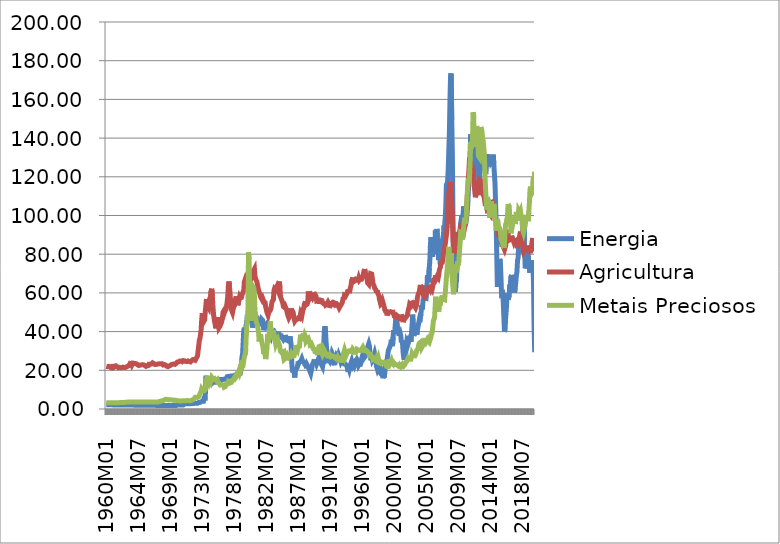
| Category | Energia | Agricultura | Metais Preciosos |
|---|---|---|---|
| 1960M01 | 2.134 | 22.032 | 3.269 |
| 1960M02 | 2.134 | 21.808 | 3.269 |
| 1960M03 | 2.134 | 21.896 | 3.269 |
| 1960M04 | 2.134 | 22.04 | 3.269 |
| 1960M05 | 2.134 | 22.049 | 3.269 |
| 1960M06 | 2.134 | 21.743 | 3.269 |
| 1960M07 | 2.134 | 21.682 | 3.269 |
| 1960M08 | 2.134 | 21.726 | 3.269 |
| 1960M09 | 2.134 | 21.878 | 3.269 |
| 1960M10 | 2.134 | 21.218 | 3.269 |
| 1960M11 | 2.134 | 20.765 | 3.269 |
| 1960M12 | 2.134 | 21.111 | 3.269 |
| 1961M01 | 2.083 | 21.223 | 3.267 |
| 1961M02 | 2.083 | 21.654 | 3.267 |
| 1961M03 | 2.083 | 22.199 | 3.267 |
| 1961M04 | 2.083 | 22.438 | 3.267 |
| 1961M05 | 2.083 | 22.354 | 3.267 |
| 1961M06 | 2.083 | 21.982 | 3.267 |
| 1961M07 | 2.083 | 21.842 | 3.267 |
| 1961M08 | 2.083 | 21.619 | 3.267 |
| 1961M09 | 2.083 | 21.386 | 3.267 |
| 1961M10 | 2.083 | 21.354 | 3.267 |
| 1961M11 | 2.083 | 21.582 | 3.276 |
| 1961M12 | 2.083 | 21.59 | 3.38 |
| 1962M01 | 2.043 | 21.317 | 3.387 |
| 1962M02 | 2.043 | 21.414 | 3.37 |
| 1962M03 | 2.043 | 21.411 | 3.361 |
| 1962M04 | 2.043 | 21.447 | 3.361 |
| 1962M05 | 2.043 | 21.657 | 3.361 |
| 1962M06 | 2.043 | 21.552 | 3.369 |
| 1962M07 | 2.043 | 21.477 | 3.381 |
| 1962M08 | 2.043 | 21.346 | 3.425 |
| 1962M09 | 2.043 | 21.489 | 3.492 |
| 1962M10 | 2.043 | 21.241 | 3.541 |
| 1962M11 | 2.043 | 21.728 | 3.527 |
| 1962M12 | 2.043 | 21.696 | 3.534 |
| 1963M01 | 2.015 | 22.077 | 3.567 |
| 1963M02 | 2.015 | 22.329 | 3.579 |
| 1963M03 | 2.015 | 22.384 | 3.593 |
| 1963M04 | 2.015 | 22.726 | 3.585 |
| 1963M05 | 2.015 | 23.479 | 3.59 |
| 1963M06 | 2.015 | 23.402 | 3.588 |
| 1963M07 | 2.015 | 23.203 | 3.601 |
| 1963M08 | 2.015 | 22.584 | 3.599 |
| 1963M09 | 2.015 | 22.697 | 3.608 |
| 1963M10 | 2.015 | 23.724 | 3.608 |
| 1963M11 | 2.015 | 23.737 | 3.613 |
| 1963M12 | 2.015 | 23.585 | 3.614 |
| 1964M01 | 1.944 | 23.984 | 3.624 |
| 1964M02 | 1.944 | 23.485 | 3.624 |
| 1964M03 | 1.944 | 23.28 | 3.624 |
| 1964M04 | 1.944 | 23.356 | 3.624 |
| 1964M05 | 1.944 | 23.185 | 3.624 |
| 1964M06 | 1.944 | 22.778 | 3.624 |
| 1964M07 | 1.944 | 22.65 | 3.624 |
| 1964M08 | 1.944 | 22.456 | 3.624 |
| 1964M09 | 1.944 | 22.637 | 3.624 |
| 1964M10 | 1.944 | 22.729 | 3.624 |
| 1964M11 | 1.944 | 22.687 | 3.624 |
| 1964M12 | 1.944 | 22.77 | 3.624 |
| 1965M01 | 1.939 | 22.439 | 3.635 |
| 1965M02 | 1.939 | 22.927 | 3.646 |
| 1965M03 | 1.939 | 22.739 | 3.646 |
| 1965M04 | 1.939 | 22.802 | 3.646 |
| 1965M05 | 1.939 | 22.587 | 3.646 |
| 1965M06 | 1.939 | 22.499 | 3.646 |
| 1965M07 | 1.939 | 22.385 | 3.646 |
| 1965M08 | 1.939 | 22.025 | 3.646 |
| 1965M09 | 1.939 | 22.272 | 3.646 |
| 1965M10 | 1.939 | 22.294 | 3.646 |
| 1965M11 | 1.939 | 22.288 | 3.646 |
| 1965M12 | 1.939 | 22.455 | 3.646 |
| 1966M01 | 1.882 | 23.1 | 3.647 |
| 1966M02 | 1.882 | 23.022 | 3.647 |
| 1966M03 | 1.882 | 23.096 | 3.649 |
| 1966M04 | 1.882 | 23.299 | 3.65 |
| 1966M05 | 1.882 | 23.221 | 3.65 |
| 1966M06 | 1.882 | 23.403 | 3.65 |
| 1966M07 | 1.882 | 23.864 | 3.65 |
| 1966M08 | 1.882 | 24.165 | 3.65 |
| 1966M09 | 1.882 | 23.508 | 3.65 |
| 1966M10 | 1.882 | 23.168 | 3.65 |
| 1966M11 | 1.882 | 23.048 | 3.65 |
| 1966M12 | 1.882 | 23.137 | 3.65 |
| 1967M01 | 1.866 | 23.052 | 3.644 |
| 1967M02 | 1.866 | 23.047 | 3.66 |
| 1967M03 | 1.866 | 23.138 | 3.66 |
| 1967M04 | 1.866 | 23.212 | 3.66 |
| 1967M05 | 1.866 | 23.298 | 3.662 |
| 1967M06 | 1.866 | 23.636 | 3.667 |
| 1967M07 | 1.866 | 23.407 | 3.941 |
| 1967M08 | 1.866 | 23.119 | 4.089 |
| 1967M09 | 1.866 | 23.338 | 4.023 |
| 1967M10 | 1.866 | 23.377 | 4.123 |
| 1967M11 | 1.866 | 23.385 | 4.28 |
| 1967M12 | 1.866 | 22.95 | 4.39 |
| 1968M01 | 1.853 | 22.778 | 4.356 |
| 1968M02 | 1.853 | 22.99 | 4.256 |
| 1968M03 | 1.853 | 22.984 | 4.626 |
| 1968M04 | 1.853 | 22.711 | 4.701 |
| 1968M05 | 1.853 | 22.727 | 5.045 |
| 1968M06 | 1.853 | 22.211 | 5.155 |
| 1968M07 | 1.853 | 22.089 | 4.93 |
| 1968M08 | 1.853 | 21.636 | 4.8 |
| 1968M09 | 1.853 | 21.879 | 4.876 |
| 1968M10 | 1.853 | 21.889 | 4.593 |
| 1968M11 | 1.853 | 22.22 | 4.672 |
| 1968M12 | 1.853 | 22.478 | 4.699 |
| 1969M01 | 1.813 | 22.493 | 4.795 |
| 1969M02 | 1.813 | 22.552 | 4.684 |
| 1969M03 | 1.813 | 22.976 | 4.706 |
| 1969M04 | 1.813 | 22.959 | 4.671 |
| 1969M05 | 1.813 | 23.167 | 4.664 |
| 1969M06 | 1.813 | 23.429 | 4.428 |
| 1969M07 | 1.813 | 23.234 | 4.422 |
| 1969M08 | 1.813 | 23.181 | 4.412 |
| 1969M09 | 1.813 | 23.064 | 4.523 |
| 1969M10 | 1.813 | 23.549 | 4.578 |
| 1969M11 | 1.813 | 23.6 | 4.452 |
| 1969M12 | 1.813 | 23.814 | 4.201 |
| 1970M01 | 2.113 | 24.26 | 4.252 |
| 1970M02 | 2.113 | 24.303 | 4.273 |
| 1970M03 | 2.113 | 24.362 | 4.273 |
| 1970M04 | 2.113 | 24.549 | 4.273 |
| 1970M05 | 2.113 | 24.791 | 4.122 |
| 1970M06 | 2.113 | 24.849 | 4.06 |
| 1970M07 | 2.113 | 24.768 | 4.098 |
| 1970M08 | 2.113 | 24.547 | 4.206 |
| 1970M09 | 2.113 | 24.459 | 4.261 |
| 1970M10 | 2.113 | 24.842 | 4.293 |
| 1970M11 | 2.113 | 25.051 | 4.302 |
| 1970M12 | 2.113 | 24.968 | 4.184 |
| 1971M01 | 2.656 | 24.883 | 4.209 |
| 1971M02 | 2.656 | 24.642 | 4.214 |
| 1971M03 | 2.656 | 24.601 | 4.286 |
| 1971M04 | 2.656 | 24.59 | 4.349 |
| 1971M05 | 2.656 | 24.523 | 4.389 |
| 1971M06 | 2.656 | 24.468 | 4.307 |
| 1971M07 | 2.763 | 24.831 | 4.336 |
| 1971M08 | 2.763 | 25 | 4.453 |
| 1971M09 | 2.763 | 24.552 | 4.255 |
| 1971M10 | 2.763 | 24.522 | 4.204 |
| 1971M11 | 2.763 | 24.358 | 4.212 |
| 1971M12 | 2.763 | 24.557 | 4.32 |
| 1972M01 | 2.872 | 24.956 | 4.539 |
| 1972M02 | 2.872 | 24.946 | 4.727 |
| 1972M03 | 2.872 | 25.557 | 4.763 |
| 1972M04 | 2.872 | 25.545 | 4.841 |
| 1972M05 | 2.872 | 25.48 | 5.206 |
| 1972M06 | 2.872 | 25.219 | 5.667 |
| 1972M07 | 2.979 | 25.184 | 6.062 |
| 1972M08 | 2.979 | 25.582 | 6.262 |
| 1972M09 | 2.979 | 26.306 | 6.097 |
| 1972M10 | 2.979 | 26.713 | 6.091 |
| 1972M11 | 2.979 | 27.461 | 5.987 |
| 1972M12 | 2.979 | 30.239 | 6.186 |
| 1973M01 | 3.396 | 32.755 | 6.302 |
| 1973M02 | 3.396 | 35.547 | 7.103 |
| 1973M03 | 3.396 | 36.329 | 7.839 |
| 1973M04 | 3.685 | 36.58 | 8.133 |
| 1973M05 | 3.685 | 40.753 | 9.043 |
| 1973M06 | 3.685 | 45.999 | 10.403 |
| 1973M07 | 4.059 | 49.506 | 10.485 |
| 1973M08 | 4.059 | 49.319 | 9.569 |
| 1973M09 | 4.059 | 44.957 | 9.37 |
| 1973M10 | 5.557 | 44.472 | 9.395 |
| 1973M11 | 5.557 | 46.079 | 9.043 |
| 1973M12 | 5.557 | 50.09 | 10.052 |
| 1974M01 | 15.97 | 53.311 | 11.954 |
| 1974M02 | 15.97 | 56.849 | 14.922 |
| 1974M03 | 15.97 | 55.345 | 16.052 |
| 1974M04 | 13.402 | 53.181 | 16.023 |
| 1974M05 | 13.402 | 52.717 | 15.829 |
| 1974M06 | 13.402 | 52.126 | 14.785 |
| 1974M07 | 12.76 | 54.121 | 13.627 |
| 1974M08 | 12.76 | 57.876 | 14.383 |
| 1974M09 | 12.76 | 57.191 | 13.84 |
| 1974M10 | 13.081 | 61.247 | 15.02 |
| 1974M11 | 13.081 | 62.155 | 16.345 |
| 1974M12 | 13.081 | 58.175 | 16.196 |
| 1975M01 | 13.836 | 52.93 | 15.532 |
| 1975M02 | 13.836 | 48.895 | 15.881 |
| 1975M03 | 13.836 | 46.725 | 15.742 |
| 1975M04 | 13.836 | 46.445 | 15.074 |
| 1975M05 | 13.836 | 43.163 | 15.221 |
| 1975M06 | 13.836 | 41.665 | 14.975 |
| 1975M07 | 13.847 | 43.831 | 15.242 |
| 1975M08 | 13.847 | 47.396 | 15.337 |
| 1975M09 | 13.847 | 45.569 | 13.756 |
| 1975M10 | 13.879 | 44.249 | 13.487 |
| 1975M11 | 13.879 | 41.889 | 13.442 |
| 1975M12 | 13.879 | 41.617 | 13.011 |
| 1976M01 | 15.188 | 42.849 | 12.467 |
| 1976M02 | 15.188 | 43.742 | 12.489 |
| 1976M03 | 15.188 | 44.367 | 12.694 |
| 1976M04 | 15.201 | 45.429 | 12.544 |
| 1976M05 | 15.201 | 47.216 | 12.604 |
| 1976M06 | 15.241 | 49.98 | 12.838 |
| 1976M07 | 15.337 | 50.504 | 12.299 |
| 1976M08 | 15.363 | 49.562 | 11.318 |
| 1976M09 | 15.363 | 50.512 | 11.616 |
| 1976M10 | 15.71 | 50.643 | 11.663 |
| 1976M11 | 15.723 | 51.397 | 12.696 |
| 1976M12 | 15.736 | 53.004 | 12.913 |
| 1977M01 | 16.72 | 55.458 | 12.867 |
| 1977M02 | 16.773 | 58.396 | 13.24 |
| 1977M03 | 16.825 | 63.486 | 14.318 |
| 1977M04 | 16.798 | 65.9 | 14.302 |
| 1977M05 | 16.798 | 62.873 | 14.046 |
| 1977M06 | 16.863 | 59.252 | 13.458 |
| 1977M07 | 17.069 | 54.032 | 13.67 |
| 1977M08 | 17.056 | 51.597 | 13.712 |
| 1977M09 | 17.069 | 50.629 | 14.067 |
| 1977M10 | 17.135 | 49.854 | 14.888 |
| 1977M11 | 17.122 | 51.418 | 15.175 |
| 1977M12 | 17.135 | 52.656 | 14.984 |
| 1978M01 | 17.396 | 53.08 | 16.037 |
| 1978M02 | 17.371 | 53.835 | 16.432 |
| 1978M03 | 17.384 | 56.473 | 17.078 |
| 1978M04 | 17.392 | 58.204 | 16.424 |
| 1978M05 | 17.526 | 57.006 | 16.496 |
| 1978M06 | 17.63 | 55.921 | 17.176 |
| 1978M07 | 17.647 | 53.614 | 17.525 |
| 1978M08 | 17.695 | 53.837 | 18.849 |
| 1978M09 | 17.718 | 56.504 | 19.269 |
| 1978M10 | 17.772 | 57.965 | 20.707 |
| 1978M11 | 18.159 | 57.422 | 19.283 |
| 1978M12 | 19.59 | 56.952 | 19.471 |
| 1979M01 | 23.363 | 57.587 | 20.994 |
| 1979M02 | 26.933 | 58.911 | 23.345 |
| 1979M03 | 28.362 | 59.849 | 23.151 |
| 1979M04 | 28.803 | 60.655 | 22.971 |
| 1979M05 | 40.706 | 61.249 | 25.107 |
| 1979M06 | 41.989 | 65.692 | 26.644 |
| 1979M07 | 40.771 | 66.589 | 28.066 |
| 1979M08 | 41.411 | 65.372 | 28.654 |
| 1979M09 | 43.015 | 66.306 | 36.414 |
| 1979M10 | 44.992 | 65.449 | 41.562 |
| 1979M11 | 48.75 | 65.765 | 41.57 |
| 1979M12 | 47.707 | 66.551 | 51.219 |
| 1980M01 | 47.621 | 66.765 | 81.058 |
| 1980M02 | 45.814 | 68.937 | 77.165 |
| 1980M03 | 45.599 | 67.003 | 59.915 |
| 1980M04 | 45.547 | 65.835 | 48.108 |
| 1980M05 | 46.148 | 68.379 | 45.684 |
| 1980M06 | 46.136 | 67.657 | 54.291 |
| 1980M07 | 44.489 | 68.008 | 57.558 |
| 1980M08 | 42.059 | 69.07 | 56.124 |
| 1980M09 | 42.008 | 71.216 | 62.887 |
| 1980M10 | 46.876 | 71.55 | 62.348 |
| 1980M11 | 50.115 | 72.392 | 58.429 |
| 1980M12 | 49.501 | 68.347 | 50.885 |
| 1981M01 | 49.786 | 68.662 | 50.389 |
| 1981M02 | 47.832 | 66.485 | 44.994 |
| 1981M03 | 47.576 | 65.866 | 44.296 |
| 1981M04 | 46.894 | 64.555 | 43.251 |
| 1981M05 | 44.689 | 62.875 | 41.604 |
| 1981M06 | 43.004 | 61.337 | 39.583 |
| 1981M07 | 43.938 | 61.228 | 34.873 |
| 1981M08 | 44.46 | 59.676 | 35.279 |
| 1981M09 | 44.538 | 58.372 | 38.515 |
| 1981M10 | 45.246 | 57.621 | 37.331 |
| 1981M11 | 46.443 | 57.418 | 35.087 |
| 1981M12 | 46.167 | 56.444 | 34.798 |
| 1982M01 | 45.757 | 57.069 | 32.657 |
| 1982M02 | 42.877 | 56.584 | 32.28 |
| 1982M03 | 40.689 | 55.458 | 28.418 |
| 1982M04 | 42.252 | 55.188 | 29.805 |
| 1982M05 | 43.897 | 55.044 | 28.107 |
| 1982M06 | 43.601 | 52.811 | 25.794 |
| 1982M07 | 43.788 | 51.433 | 28.188 |
| 1982M08 | 43.332 | 50.097 | 30.417 |
| 1982M09 | 44.494 | 49.839 | 36.708 |
| 1982M10 | 44.885 | 48.418 | 36.314 |
| 1982M11 | 43.913 | 49.693 | 36.255 |
| 1982M12 | 41.957 | 50.256 | 38.914 |
| 1983M01 | 40.78 | 50.374 | 43.085 |
| 1983M02 | 39.132 | 51.144 | 45.268 |
| 1983M03 | 38.178 | 52.153 | 37.471 |
| 1983M04 | 39.582 | 54.255 | 39.248 |
| 1983M05 | 39.226 | 55.71 | 40.869 |
| 1983M06 | 39.953 | 55.403 | 38.111 |
| 1983M07 | 40.009 | 56.467 | 37.775 |
| 1983M08 | 40.287 | 61.361 | 38.655 |
| 1983M09 | 39.78 | 62.324 | 38.267 |
| 1983M10 | 39.178 | 62.425 | 35.095 |
| 1983M11 | 38.593 | 61.73 | 33.313 |
| 1983M12 | 38.098 | 61.774 | 34.059 |
| 1984M01 | 38.252 | 63.194 | 32.079 |
| 1984M02 | 38.476 | 62.288 | 33.878 |
| 1984M03 | 38.776 | 63.672 | 34.918 |
| 1984M04 | 38.78 | 64.259 | 33.709 |
| 1984M05 | 38.698 | 65.865 | 33.186 |
| 1984M06 | 38.416 | 62.786 | 33.009 |
| 1984M07 | 37.252 | 58.025 | 29.789 |
| 1984M08 | 37.461 | 57.142 | 29.915 |
| 1984M09 | 37.566 | 56.867 | 29.088 |
| 1984M10 | 37.044 | 55.579 | 29.169 |
| 1984M11 | 36.847 | 54.464 | 29.428 |
| 1984M12 | 35.947 | 52.865 | 27.15 |
| 1985M01 | 35.789 | 52.648 | 25.521 |
| 1985M02 | 36.915 | 52.407 | 25.243 |
| 1985M03 | 37.065 | 52.984 | 26.075 |
| 1985M04 | 37.037 | 53.202 | 27.388 |
| 1985M05 | 35.663 | 51.471 | 26.516 |
| 1985M06 | 35.425 | 50.23 | 26.452 |
| 1985M07 | 35.352 | 48.799 | 26.332 |
| 1985M08 | 35.977 | 47.89 | 27.392 |
| 1985M09 | 35.876 | 47.048 | 26.861 |
| 1985M10 | 36.702 | 46.934 | 27.159 |
| 1985M11 | 37.527 | 48.223 | 26.834 |
| 1985M12 | 35.176 | 50.623 | 26.63 |
| 1986M01 | 33.149 | 51.965 | 28.464 |
| 1986M02 | 23.743 | 50.903 | 27.796 |
| 1986M03 | 19.976 | 51.2 | 28.083 |
| 1986M04 | 19.095 | 50.273 | 27.35 |
| 1986M05 | 20.856 | 48.856 | 27.357 |
| 1986M06 | 18.714 | 46.573 | 27.47 |
| 1986M07 | 16.259 | 45.413 | 27.741 |
| 1986M08 | 20.589 | 45.147 | 29.894 |
| 1986M09 | 21.012 | 46.329 | 33.054 |
| 1986M10 | 20.804 | 46.295 | 33.383 |
| 1986M11 | 21.392 | 46.346 | 31.521 |
| 1986M12 | 22.628 | 45.852 | 30.836 |
| 1987M01 | 24.554 | 47.014 | 32.157 |
| 1987M02 | 23.667 | 47.152 | 31.685 |
| 1987M03 | 24.202 | 46.773 | 32.38 |
| 1987M04 | 24.099 | 47.714 | 35.941 |
| 1987M05 | 24.581 | 49.44 | 38.417 |
| 1987M06 | 24.92 | 48.793 | 36.683 |
| 1987M07 | 26.002 | 48.149 | 36.93 |
| 1987M08 | 25.107 | 48.393 | 37.901 |
| 1987M09 | 24.445 | 51.366 | 37.59 |
| 1987M10 | 24.761 | 51.944 | 37.862 |
| 1987M11 | 24.073 | 53.777 | 37.071 |
| 1987M12 | 23.05 | 54.619 | 38.304 |
| 1988M01 | 23.094 | 55.638 | 37.614 |
| 1988M02 | 22.277 | 53.77 | 34.971 |
| 1988M03 | 21.047 | 53.55 | 35.211 |
| 1988M04 | 22.704 | 54.208 | 35.843 |
| 1988M05 | 22.345 | 55.335 | 35.913 |
| 1988M06 | 21.554 | 60.762 | 36.439 |
| 1988M07 | 20.684 | 60.455 | 35.53 |
| 1988M08 | 20.833 | 57.201 | 34.786 |
| 1988M09 | 19.211 | 57.792 | 33.298 |
| 1988M10 | 18.427 | 57.495 | 32.81 |
| 1988M11 | 18.929 | 57.415 | 33.775 |
| 1988M12 | 21.388 | 58.229 | 33.52 |
| 1989M01 | 23.063 | 57.643 | 32.367 |
| 1989M02 | 22.829 | 57.544 | 31.226 |
| 1989M03 | 24.342 | 59.111 | 31.476 |
| 1989M04 | 25.643 | 59.068 | 30.953 |
| 1989M05 | 24.547 | 59.306 | 29.744 |
| 1989M06 | 24.189 | 59.436 | 29.314 |
| 1989M07 | 24.146 | 58.199 | 29.745 |
| 1989M08 | 23.229 | 55.977 | 29.049 |
| 1989M09 | 24.002 | 56.231 | 28.774 |
| 1989M10 | 24.896 | 56.227 | 29.127 |
| 1989M11 | 25.235 | 55.569 | 31.233 |
| 1989M12 | 26.732 | 55.078 | 32.268 |
| 1990M01 | 28.398 | 55.582 | 31.992 |
| 1990M02 | 26.955 | 55.814 | 32.495 |
| 1990M03 | 25.017 | 56.25 | 30.748 |
| 1990M04 | 23.155 | 56.576 | 29.504 |
| 1990M05 | 23.282 | 56.049 | 29.208 |
| 1990M06 | 21.873 | 54.896 | 27.98 |
| 1990M07 | 23.828 | 54.864 | 28.582 |
| 1990M08 | 33.642 | 54.379 | 30.781 |
| 1990M09 | 40.487 | 54.381 | 30.182 |
| 1990M10 | 42.74 | 54.35 | 29.173 |
| 1990M11 | 39.621 | 53.674 | 29.027 |
| 1990M12 | 34.337 | 53.788 | 28.627 |
| 1991M01 | 30.307 | 54.131 | 29.005 |
| 1991M02 | 25.124 | 54.645 | 27.409 |
| 1991M03 | 24.939 | 55.232 | 27.598 |
| 1991M04 | 25.425 | 54.623 | 27.307 |
| 1991M05 | 25.723 | 53.523 | 27.268 |
| 1991M06 | 24.593 | 53.894 | 28.183 |
| 1991M07 | 25.626 | 53.386 | 28.205 |
| 1991M08 | 26.111 | 54.266 | 27.055 |
| 1991M09 | 27.256 | 54.728 | 26.656 |
| 1991M10 | 28.822 | 54.8 | 27.388 |
| 1991M11 | 28.12 | 54.366 | 27.447 |
| 1991M12 | 25.036 | 54.287 | 27.4 |
| 1992M01 | 23.711 | 54.973 | 27.07 |
| 1992M02 | 23.827 | 54.734 | 27.112 |
| 1992M03 | 23.787 | 54.655 | 26.46 |
| 1992M04 | 25.241 | 53.894 | 26.021 |
| 1992M05 | 26.331 | 54.067 | 25.976 |
| 1992M06 | 27.725 | 54.275 | 26.217 |
| 1992M07 | 27.295 | 53.782 | 26.912 |
| 1992M08 | 27.002 | 53.534 | 26.104 |
| 1992M09 | 28.048 | 53.111 | 26.222 |
| 1992M10 | 28.024 | 52.19 | 26.129 |
| 1992M11 | 26.4 | 52.756 | 25.548 |
| 1992M12 | 25.283 | 52.843 | 25.504 |
| 1993M01 | 24.207 | 53.72 | 25.09 |
| 1993M02 | 24.774 | 54.18 | 25.083 |
| 1993M03 | 25.739 | 54.859 | 25.106 |
| 1993M04 | 25.893 | 56.033 | 26.195 |
| 1993M05 | 25.368 | 57.751 | 28.301 |
| 1993M06 | 24.355 | 56.689 | 28.513 |
| 1993M07 | 23.232 | 58.793 | 30.449 |
| 1993M08 | 23.664 | 58.557 | 29.406 |
| 1993M09 | 23.036 | 58.47 | 27.268 |
| 1993M10 | 23.363 | 58.603 | 27.962 |
| 1993M11 | 22.265 | 59.646 | 28.766 |
| 1993M12 | 20.818 | 60.738 | 29.798 |
| 1994M01 | 21.134 | 60.817 | 30.198 |
| 1994M02 | 21.193 | 60.984 | 29.99 |
| 1994M03 | 20.287 | 60.779 | 30.32 |
| 1994M04 | 21.628 | 60.981 | 29.802 |
| 1994M05 | 22.844 | 62.773 | 30.13 |
| 1994M06 | 23.869 | 63.805 | 30.374 |
| 1994M07 | 24.724 | 66.271 | 30.287 |
| 1994M08 | 23.415 | 66.539 | 29.882 |
| 1994M09 | 22.349 | 67.937 | 30.912 |
| 1994M10 | 22.7 | 65.737 | 30.736 |
| 1994M11 | 23.457 | 65.673 | 30.134 |
| 1994M12 | 22.555 | 66.105 | 29.419 |
| 1995M01 | 23.411 | 66.19 | 29.372 |
| 1995M02 | 24.082 | 66.994 | 29.202 |
| 1995M03 | 23.989 | 67.039 | 29.488 |
| 1995M04 | 25.456 | 66.609 | 30.897 |
| 1995M05 | 25.327 | 66.594 | 30.582 |
| 1995M06 | 24.274 | 66.424 | 30.549 |
| 1995M07 | 22.712 | 67.545 | 30.268 |
| 1995M08 | 23.27 | 66.56 | 30.308 |
| 1995M09 | 23.744 | 66.192 | 30.307 |
| 1995M10 | 23.155 | 67.319 | 30.226 |
| 1995M11 | 24.103 | 67.785 | 30.309 |
| 1995M12 | 26.157 | 67.19 | 30.305 |
| 1996M01 | 26.389 | 67.307 | 31.349 |
| 1996M02 | 28.211 | 68.599 | 31.88 |
| 1996M03 | 28.072 | 68.546 | 31.194 |
| 1996M04 | 28.721 | 71.338 | 30.869 |
| 1996M05 | 26.827 | 72.295 | 30.753 |
| 1996M06 | 26.565 | 70.648 | 30.12 |
| 1996M07 | 27.695 | 69.618 | 29.918 |
| 1996M08 | 28.027 | 69.019 | 30.243 |
| 1996M09 | 29.711 | 67.311 | 29.864 |
| 1996M10 | 31.914 | 65.188 | 29.617 |
| 1996M11 | 31.41 | 64.904 | 29.319 |
| 1996M12 | 33.75 | 64.466 | 28.727 |
| 1997M01 | 32.621 | 66.505 | 27.775 |
| 1997M02 | 28.169 | 68.021 | 27.523 |
| 1997M03 | 26.538 | 69.952 | 28 |
| 1997M04 | 25.169 | 69.492 | 27.12 |
| 1997M05 | 27.031 | 69.725 | 27.091 |
| 1997M06 | 25.383 | 67.495 | 26.991 |
| 1997M07 | 25.775 | 65.002 | 25.54 |
| 1997M08 | 26.614 | 64.129 | 25.669 |
| 1997M09 | 27.083 | 63.578 | 25.815 |
| 1997M10 | 28.778 | 62.385 | 26.227 |
| 1997M11 | 27.584 | 62.432 | 25.009 |
| 1997M12 | 24.431 | 61.589 | 24.568 |
| 1998M01 | 21.889 | 60.188 | 24.655 |
| 1998M02 | 21.161 | 61.342 | 26.077 |
| 1998M03 | 20.046 | 59.934 | 25.475 |
| 1998M04 | 20.611 | 60.277 | 26.382 |
| 1998M05 | 20.737 | 58.788 | 25.028 |
| 1998M06 | 19.102 | 56.522 | 24.236 |
| 1998M07 | 19.275 | 55.739 | 24.498 |
| 1998M08 | 18.432 | 54.374 | 23.664 |
| 1998M09 | 20.066 | 54.656 | 23.788 |
| 1998M10 | 19.252 | 55.127 | 24.201 |
| 1998M11 | 17.994 | 55.957 | 24.061 |
| 1998M12 | 15.932 | 54.93 | 23.826 |
| 1999M01 | 17.142 | 55.162 | 23.786 |
| 1999M02 | 16.281 | 52.696 | 24.188 |
| 1999M03 | 18.859 | 51.309 | 23.797 |
| 1999M04 | 22.176 | 50.57 | 23.433 |
| 1999M05 | 22.537 | 50.31 | 23.227 |
| 1999M06 | 22.969 | 49.941 | 22.047 |
| 1999M07 | 25.807 | 48.338 | 21.843 |
| 1999M08 | 27.862 | 49.296 | 21.959 |
| 1999M09 | 30.21 | 50.17 | 22.465 |
| 1999M10 | 29.774 | 50.062 | 25.679 |
| 1999M11 | 31.68 | 49.999 | 24.348 |
| 1999M12 | 32.774 | 49.864 | 23.72 |
| 2000M01 | 33.451 | 50.275 | 23.832 |
| 2000M02 | 35.852 | 50.373 | 25.034 |
| 2000M03 | 36.367 | 50.005 | 23.926 |
| 2000M04 | 32.48 | 50.361 | 23.537 |
| 2000M05 | 37.125 | 50.041 | 23.229 |
| 2000M06 | 40.686 | 49.142 | 23.984 |
| 2000M07 | 38.915 | 47.948 | 23.696 |
| 2000M08 | 40.69 | 47.71 | 23.201 |
| 2000M09 | 44.645 | 47.5 | 23.184 |
| 2000M10 | 44.016 | 47.561 | 22.869 |
| 2000M11 | 45.753 | 47.374 | 22.503 |
| 2000M12 | 42.765 | 48.078 | 22.842 |
| 2001M01 | 42.708 | 48.002 | 22.502 |
| 2001M02 | 40.72 | 47.439 | 22.139 |
| 2001M03 | 37.753 | 47.203 | 22.035 |
| 2001M04 | 38.496 | 46.623 | 21.858 |
| 2001M05 | 39.144 | 46.951 | 22.709 |
| 2001M06 | 37.861 | 46.829 | 22.454 |
| 2001M07 | 34.454 | 48.819 | 22.071 |
| 2001M08 | 35.349 | 48.674 | 22.187 |
| 2001M09 | 33.599 | 47.145 | 23.024 |
| 2001M10 | 29.049 | 44.867 | 22.993 |
| 2001M11 | 26.558 | 46.093 | 22.29 |
| 2001M12 | 26.308 | 46.309 | 22.567 |
| 2002M01 | 26.599 | 46.625 | 23.084 |
| 2002M02 | 27.569 | 46.641 | 23.885 |
| 2002M03 | 32.378 | 47.572 | 23.986 |
| 2002M04 | 34.69 | 47.58 | 24.623 |
| 2002M05 | 35.04 | 48.25 | 25.478 |
| 2002M06 | 33.366 | 50.02 | 26.138 |
| 2002M07 | 34.388 | 51.667 | 25.592 |
| 2002M08 | 35.597 | 52.437 | 25.082 |
| 2002M09 | 37.9 | 54.219 | 25.682 |
| 2002M10 | 38.006 | 54.332 | 25.424 |
| 2002M11 | 34.74 | 53.595 | 25.702 |
| 2002M12 | 39.245 | 54.663 | 26.647 |
| 2003M01 | 43.336 | 54.95 | 28.461 |
| 2003M02 | 48.766 | 54.933 | 28.563 |
| 2003M03 | 43.674 | 54.261 | 27.259 |
| 2003M04 | 37.779 | 53.788 | 26.34 |
| 2003M05 | 39.036 | 53.366 | 28.371 |
| 2003M06 | 40.977 | 52.861 | 28.235 |
| 2003M07 | 40.7 | 52.303 | 28.191 |
| 2003M08 | 41.824 | 53.124 | 28.949 |
| 2003M09 | 38.429 | 54.471 | 30.364 |
| 2003M10 | 40.726 | 57.443 | 30.26 |
| 2003M11 | 40.832 | 58.929 | 31.18 |
| 2003M12 | 44.06 | 58.828 | 32.781 |
| 2004M01 | 45.64 | 60.467 | 33.933 |
| 2004M02 | 44.868 | 61.996 | 33.492 |
| 2004M03 | 47.716 | 64.116 | 34.451 |
| 2004M04 | 48.419 | 63.659 | 34.124 |
| 2004M05 | 53.51 | 62.383 | 31.539 |
| 2004M06 | 51.457 | 61.127 | 32.075 |
| 2004M07 | 53.748 | 59.827 | 32.867 |
| 2004M08 | 57.474 | 59.004 | 33.425 |
| 2004M09 | 56.49 | 58.775 | 33.485 |
| 2004M10 | 64.091 | 57.946 | 35.086 |
| 2004M11 | 58.459 | 58.28 | 36.688 |
| 2004M12 | 55.816 | 58.618 | 36.464 |
| 2005M01 | 59.717 | 59.03 | 34.902 |
| 2005M02 | 61.558 | 61.002 | 35.255 |
| 2005M03 | 69.253 | 63.983 | 36.114 |
| 2005M04 | 69.366 | 62.485 | 35.714 |
| 2005M05 | 65.485 | 62.283 | 35.158 |
| 2005M06 | 72.902 | 62.15 | 36.015 |
| 2005M07 | 76.408 | 61.951 | 35.332 |
| 2005M08 | 84.941 | 61.147 | 36.254 |
| 2005M09 | 88.811 | 61.815 | 37.551 |
| 2005M10 | 86.143 | 62.673 | 38.95 |
| 2005M11 | 78.632 | 62.046 | 39.634 |
| 2005M12 | 83.265 | 63.434 | 42.494 |
| 2006M01 | 84.741 | 65.568 | 45.602 |
| 2006M02 | 80.506 | 67.552 | 46.331 |
| 2006M03 | 81.151 | 66.402 | 47.261 |
| 2006M04 | 89.219 | 66.556 | 52.876 |
| 2006M05 | 88.809 | 68.973 | 58.035 |
| 2006M06 | 88.397 | 67.688 | 50.43 |
| 2006M07 | 93.071 | 68.359 | 53.307 |
| 2006M08 | 93.371 | 68.322 | 54.143 |
| 2006M09 | 80.094 | 67.632 | 51.376 |
| 2006M10 | 76.953 | 69.237 | 50.271 |
| 2006M11 | 79.255 | 71.566 | 54.436 |
| 2006M12 | 81.312 | 72.676 | 54.761 |
| 2007M01 | 73.205 | 73.431 | 54.49 |
| 2007M02 | 79.394 | 75.367 | 57.745 |
| 2007M03 | 81.55 | 75.259 | 56.466 |
| 2007M04 | 86.789 | 75.689 | 58.643 |
| 2007M05 | 86.924 | 77.25 | 57.387 |
| 2007M06 | 90.043 | 79.797 | 56.615 |
| 2007M07 | 94.749 | 81.364 | 57.045 |
| 2007M08 | 91.234 | 81.742 | 56.427 |
| 2007M09 | 98.292 | 85.155 | 59.986 |
| 2007M10 | 105.43 | 87.544 | 63.647 |
| 2007M11 | 116.563 | 89.986 | 67.974 |
| 2007M12 | 114.948 | 92.449 | 67.496 |
| 2008M01 | 118.022 | 97.501 | 74.676 |
| 2008M02 | 123.632 | 105.537 | 79.161 |
| 2008M03 | 133.284 | 111.541 | 83.786 |
| 2008M04 | 142.485 | 113.577 | 78.273 |
| 2008M05 | 159.359 | 113.668 | 76.654 |
| 2008M06 | 172.171 | 117.13 | 76.594 |
| 2008M07 | 173.432 | 115.389 | 80.514 |
| 2008M08 | 149.292 | 106.672 | 70.068 |
| 2008M09 | 132.408 | 101.67 | 66.831 |
| 2008M10 | 100.922 | 87.372 | 62.903 |
| 2008M11 | 80.016 | 82.745 | 59.308 |
| 2008M12 | 64.455 | 80.254 | 63.21 |
| 2009M01 | 65.557 | 85.236 | 67.058 |
| 2009M02 | 60.651 | 84.522 | 74.603 |
| 2009M03 | 64.22 | 83.723 | 73.234 |
| 2009M04 | 66.315 | 86.569 | 70.642 |
| 2009M05 | 74.932 | 91.54 | 74.422 |
| 2009M06 | 86.918 | 91.48 | 76.315 |
| 2009M07 | 81.065 | 88.109 | 74.261 |
| 2009M08 | 88.281 | 91.276 | 76.325 |
| 2009M09 | 84.451 | 90.171 | 81.324 |
| 2009M10 | 92.427 | 91.806 | 85.167 |
| 2009M11 | 96.18 | 94.374 | 91.182 |
| 2009M12 | 95.864 | 95.285 | 91.578 |
| 2010M01 | 99.915 | 96.231 | 90.859 |
| 2010M02 | 96.68 | 93.721 | 87.587 |
| 2010M03 | 100.235 | 92.123 | 90.045 |
| 2010M04 | 104.678 | 93.39 | 93.415 |
| 2010M05 | 95.611 | 92.561 | 97.194 |
| 2010M06 | 95.574 | 92.446 | 98.814 |
| 2010M07 | 95.309 | 95.728 | 95.756 |
| 2010M08 | 96.139 | 99.794 | 97.638 |
| 2010M09 | 96.059 | 103.788 | 103.278 |
| 2010M10 | 101.569 | 108.718 | 110.659 |
| 2010M11 | 105.557 | 113.038 | 115.394 |
| 2010M12 | 112.673 | 118.462 | 119.36 |
| 2011M01 | 117.045 | 123.85 | 116.833 |
| 2011M02 | 121.806 | 129.922 | 119.951 |
| 2011M03 | 133.087 | 125.906 | 127.653 |
| 2011M04 | 141.944 | 127.459 | 137.834 |
| 2011M05 | 133.139 | 123.87 | 134.79 |
| 2011M06 | 131.166 | 122.995 | 134.371 |
| 2011M07 | 133.734 | 122.653 | 139.103 |
| 2011M08 | 125.216 | 123.437 | 153.293 |
| 2011M09 | 125.512 | 121.377 | 151.967 |
| 2011M10 | 124.17 | 115.339 | 139.014 |
| 2011M11 | 129.397 | 112.019 | 144.789 |
| 2011M12 | 128.019 | 109.426 | 135.599 |
| 2012M01 | 130.635 | 111.134 | 136.911 |
| 2012M02 | 136.238 | 113.371 | 146.277 |
| 2012M03 | 141.238 | 114.541 | 140.783 |
| 2012M04 | 136.117 | 114.746 | 137.6 |
| 2012M05 | 126.277 | 112.898 | 130.909 |
| 2012M06 | 111.53 | 110.53 | 130.78 |
| 2012M07 | 118.55 | 118.441 | 129.941 |
| 2012M08 | 127.654 | 118.071 | 133.57 |
| 2012M09 | 128.527 | 118.113 | 145.707 |
| 2012M10 | 125.881 | 114.939 | 145.449 |
| 2012M11 | 124.076 | 112.557 | 143.355 |
| 2012M12 | 124.175 | 112.129 | 140.18 |
| 2013M01 | 128.411 | 111.19 | 138.711 |
| 2013M02 | 131.22 | 110.021 | 135.283 |
| 2013M03 | 126.222 | 109.007 | 131.462 |
| 2013M04 | 123.127 | 106.736 | 121.367 |
| 2013M05 | 123.209 | 107.082 | 114.464 |
| 2013M06 | 122.936 | 107.098 | 108.071 |
| 2013M07 | 128.117 | 104.711 | 103.025 |
| 2013M08 | 130.926 | 102.609 | 109.476 |
| 2013M09 | 131.601 | 102.604 | 109.825 |
| 2013M10 | 128.285 | 102.862 | 107.096 |
| 2013M11 | 125.381 | 102.057 | 103.434 |
| 2013M12 | 129.482 | 102.201 | 98.828 |
| 2014M01 | 126.381 | 100.965 | 100.6 |
| 2014M02 | 130.574 | 103.206 | 105.001 |
| 2014M03 | 127.931 | 108.071 | 107.284 |
| 2014M04 | 128.412 | 107.312 | 103.93 |
| 2014M05 | 128.96 | 106.878 | 102.996 |
| 2014M06 | 131.477 | 104.656 | 102.893 |
| 2014M07 | 126.926 | 102.608 | 105.942 |
| 2014M08 | 121.204 | 100.94 | 103.751 |
| 2014M09 | 116.621 | 97.809 | 98.569 |
| 2014M10 | 106.197 | 97.306 | 96.34 |
| 2014M11 | 96.383 | 97.15 | 92.115 |
| 2014M12 | 78.553 | 95.712 | 94.045 |
| 2015M01 | 63.103 | 93.671 | 98.168 |
| 2015M02 | 70.87 | 91.99 | 96.151 |
| 2015M03 | 68.42 | 89.801 | 92.44 |
| 2015M04 | 71.858 | 89.454 | 93.85 |
| 2015M05 | 77.576 | 89.278 | 94.271 |
| 2015M06 | 76.077 | 89.084 | 92.366 |
| 2015M07 | 68.783 | 89.422 | 87.866 |
| 2015M08 | 59.25 | 85.608 | 87.05 |
| 2015M09 | 59.66 | 83.856 | 87.265 |
| 2015M10 | 59.648 | 84.764 | 90.479 |
| 2015M11 | 54.828 | 83.703 | 84.389 |
| 2015M12 | 47.375 | 83.658 | 83.352 |
| 2016M01 | 40.011 | 82.299 | 84.731 |
| 2016M02 | 40.784 | 82.531 | 92.311 |
| 2016M03 | 47.202 | 84.412 | 95.589 |
| 2016M04 | 51.009 | 86.889 | 96.301 |
| 2016M05 | 56.754 | 89.632 | 98.124 |
| 2016M06 | 59.77 | 92.584 | 99.318 |
| 2016M07 | 56.63 | 90.364 | 105.899 |
| 2016M08 | 57.433 | 89.144 | 105.811 |
| 2016M09 | 58.229 | 88.625 | 104.581 |
| 2016M10 | 64.324 | 87.424 | 98.989 |
| 2016M11 | 60.035 | 87.911 | 96.956 |
| 2016M12 | 68.466 | 87.698 | 90.821 |
| 2017M01 | 69.278 | 89.513 | 93.577 |
| 2017M02 | 69.322 | 88.998 | 97.294 |
| 2017M03 | 65.195 | 87.736 | 96.742 |
| 2017M04 | 66.987 | 86.873 | 99.368 |
| 2017M05 | 64.227 | 88.198 | 96.772 |
| 2017M06 | 60.208 | 87.158 | 97.851 |
| 2017M07 | 62.191 | 87.539 | 95.607 |
| 2017M08 | 65.294 | 85.61 | 99.403 |
| 2017M09 | 68.817 | 86.142 | 101.808 |
| 2017M10 | 70.85 | 85.326 | 99.063 |
| 2017M11 | 76.632 | 85.601 | 99.276 |
| 2017M12 | 78.107 | 84.811 | 97.35 |
| 2018M01 | 85.039 | 87.037 | 102.668 |
| 2018M02 | 80.539 | 88.676 | 102.114 |
| 2018M03 | 80.893 | 90.038 | 101.56 |
| 2018M04 | 85.912 | 91.659 | 102.304 |
| 2018M05 | 91.747 | 91.84 | 100.127 |
| 2018M06 | 90.814 | 88.938 | 98.745 |
| 2018M07 | 91.691 | 86.35 | 95.083 |
| 2018M08 | 90.383 | 84.834 | 92.049 |
| 2018M09 | 95.63 | 82.644 | 91.167 |
| 2018M10 | 96.866 | 83.382 | 92.603 |
| 2018M11 | 81.912 | 82.228 | 92.741 |
| 2018M12 | 72.638 | 82.631 | 94.912 |
| 2019M01 | 73.804 | 83.502 | 98.371 |
| 2019M02 | 77.392 | 83.756 | 100.372 |
| 2019M03 | 79.947 | 83.003 | 98.717 |
| 2019M04 | 84.189 | 83.082 | 97.629 |
| 2019M05 | 81.784 | 82.243 | 97.01 |
| 2019M06 | 73.058 | 84.498 | 102.096 |
| 2019M07 | 74.85 | 83.299 | 106.298 |
| 2019M08 | 70.375 | 80.775 | 113.234 |
| 2019M09 | 73.613 | 80.766 | 114.934 |
| 2019M10 | 70.905 | 82.279 | 113.352 |
| 2019M11 | 74.619 | 85.282 | 111.384 |
| 2019M12 | 76.934 | 87.296 | 111.935 |
| 2020M01 | 74.455 | 88.321 | 118.026 |
| 2020M02 | 64.979 | 86.04 | 120.2 |
| 2020M03 | 42.08 | 83.356 | 116.645 |
| 2020M04 | 29.376 | 81.464 | 122.6 |